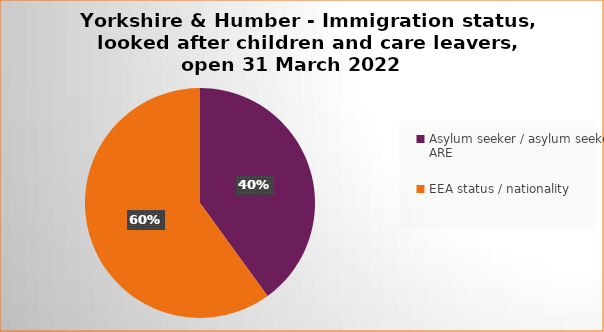
| Category | Number  | Percentage |
|---|---|---|
| Asylum seeker / asylum seeker ARE | 2 | 0.4 |
| EEA status / nationality  | 3 | 0.6 |